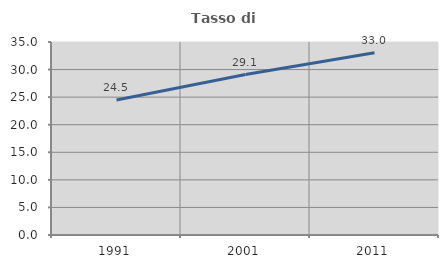
| Category | Tasso di occupazione   |
|---|---|
| 1991.0 | 24.494 |
| 2001.0 | 29.099 |
| 2011.0 | 33.036 |